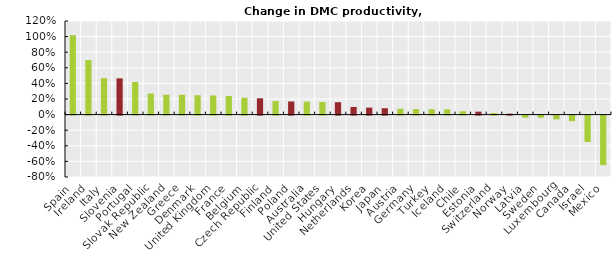
| Category | Series 0 |
|---|---|
| Mexico | -0.635 |
| Israel | -0.338 |
| Canada | -0.072 |
| Luxembourg | -0.048 |
| Sweden | -0.028 |
| Latvia | -0.027 |
| Norway | 0.012 |
| Switzerland | 0.019 |
| Estonia | 0.037 |
| Chile | 0.043 |
| Iceland | 0.068 |
| Turkey | 0.069 |
| Germany | 0.071 |
| Austria | 0.076 |
| Japan | 0.082 |
| Korea | 0.09 |
| Netherlands | 0.098 |
| Hungary | 0.159 |
| United States | 0.162 |
| Australia | 0.166 |
| Poland | 0.168 |
| Finland | 0.175 |
| Czech Republic | 0.209 |
| Belgium | 0.215 |
| France | 0.239 |
| United Kingdom | 0.245 |
| Denmark | 0.248 |
| Greece | 0.254 |
| New Zealand | 0.255 |
| Slovak Republic | 0.27 |
| Portugal | 0.418 |
| Slovenia | 0.465 |
| Italy | 0.467 |
| Ireland | 0.698 |
| Spain | 1.017 |